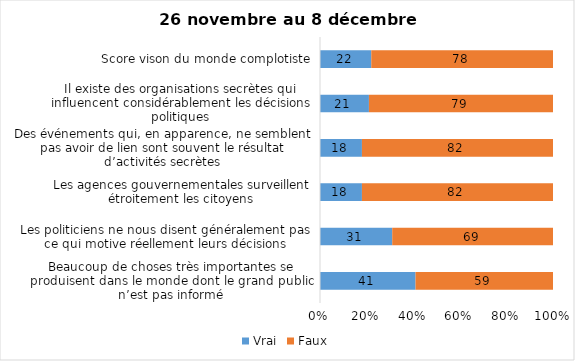
| Category | Vrai | Faux |
|---|---|---|
| Beaucoup de choses très importantes se produisent dans le monde dont le grand public n’est pas informé | 41 | 59 |
| Les politiciens ne nous disent généralement pas ce qui motive réellement leurs décisions | 31 | 69 |
| Les agences gouvernementales surveillent étroitement les citoyens | 18 | 82 |
| Des événements qui, en apparence, ne semblent pas avoir de lien sont souvent le résultat d’activités secrètes | 18 | 82 |
| Il existe des organisations secrètes qui influencent considérablement les décisions politiques | 21 | 79 |
| Score vison du monde complotiste | 22 | 78 |